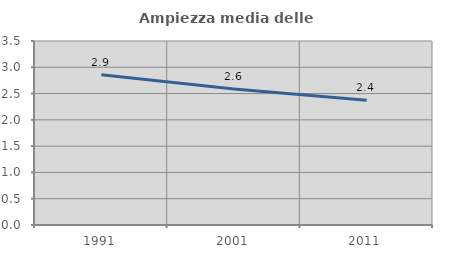
| Category | Ampiezza media delle famiglie |
|---|---|
| 1991.0 | 2.858 |
| 2001.0 | 2.586 |
| 2011.0 | 2.375 |